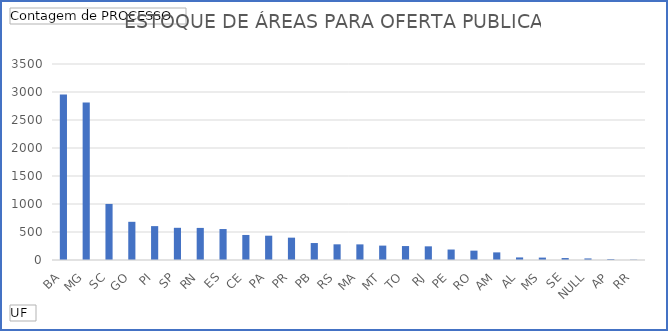
| Category | Total |
|---|---|
| BA | 2956 |
| MG | 2811 |
| SC | 1001 |
| GO | 682 |
| PI | 605 |
| SP | 575 |
| RN | 573 |
| ES | 553 |
| CE | 447 |
| PA | 434 |
| PR | 399 |
| PB | 303 |
| RS | 280 |
| MA | 279 |
| MT | 257 |
| TO | 249 |
| RJ | 244 |
| PE | 187 |
| RO | 167 |
| AM | 136 |
| AL | 46 |
| MS | 43 |
| SE | 35 |
| NULL | 28 |
| AP | 16 |
| RR | 6 |